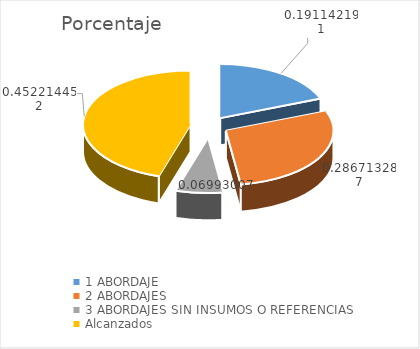
| Category | Porcentaje |
|---|---|
| 1 ABORDAJE  | 0.191 |
| 2 ABORDAJES | 0.287 |
| 3 ABORDAJES SIN INSUMOS O REFERENCIAS | 0.07 |
| Alcanzados | 0.452 |